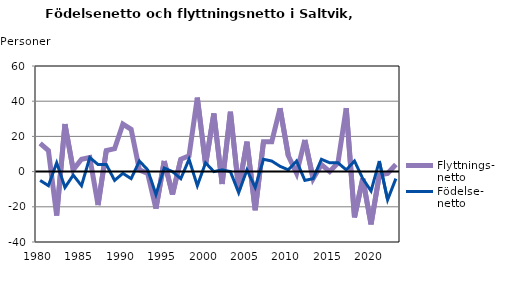
| Category | Flyttnings- netto | Födelse- netto |
|---|---|---|
| 1980.0 | 16 | -5 |
| 1981.0 | 12 | -8 |
| 1982.0 | -25 | 5 |
| 1983.0 | 27 | -9 |
| 1984.0 | 1 | -2 |
| 1985.0 | 7 | -8 |
| 1986.0 | 8 | 8 |
| 1987.0 | -19 | 4 |
| 1988.0 | 12 | 4 |
| 1989.0 | 13 | -5 |
| 1990.0 | 27 | -1 |
| 1991.0 | 24 | -4 |
| 1992.0 | 1 | 6 |
| 1993.0 | -1 | 1 |
| 1994.0 | -21 | -13 |
| 1995.0 | 6 | 2 |
| 1996.0 | -13 | 0 |
| 1997.0 | 7 | -4 |
| 1998.0 | 9 | 7 |
| 1999.0 | 42 | -8 |
| 2000.0 | 4 | 5 |
| 2001.0 | 33 | 0 |
| 2002.0 | -7 | 1 |
| 2003.0 | 34 | 0 |
| 2004.0 | -10 | -12 |
| 2005.0 | 17 | 1 |
| 2006.0 | -22 | -9 |
| 2007.0 | 17 | 7 |
| 2008.0 | 17 | 6 |
| 2009.0 | 36 | 3 |
| 2010.0 | 9 | 1 |
| 2011.0 | -1 | 6 |
| 2012.0 | 18 | -5 |
| 2013.0 | -4 | -4 |
| 2014.0 | 4 | 7 |
| 2015.0 | 0 | 5 |
| 2016.0 | 5 | 5 |
| 2017.0 | 36 | 1 |
| 2018.0 | -26 | 6 |
| 2019.0 | -4 | -4 |
| 2020.0 | -30 | -11 |
| 2021.0 | -2 | 6 |
| 2022.0 | -1 | -16 |
| 2023.0 | 4 | -4 |